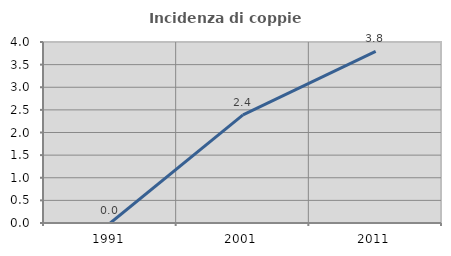
| Category | Incidenza di coppie miste |
|---|---|
| 1991.0 | 0 |
| 2001.0 | 2.39 |
| 2011.0 | 3.791 |